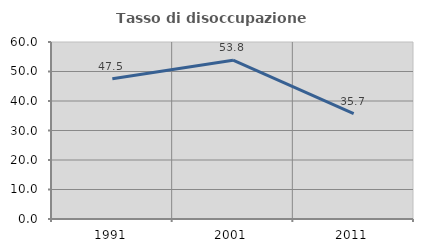
| Category | Tasso di disoccupazione giovanile  |
|---|---|
| 1991.0 | 47.541 |
| 2001.0 | 53.846 |
| 2011.0 | 35.714 |